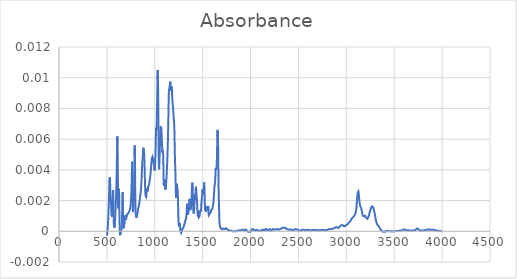
| Category | Absorbance |
|---|---|
| 3997.70514 | 0 |
| 3995.77668 | 0 |
| 3993.84822 | 0 |
| 3991.91975 | 0 |
| 3989.99129 | 0 |
| 3988.06283 | 0 |
| 3986.13436 | 0 |
| 3984.2059 | 0 |
| 3982.27743 | 0 |
| 3980.34897 | 0 |
| 3978.42051 | 0 |
| 3976.49204 | 0 |
| 3974.56358 | 0 |
| 3972.63512 | 0 |
| 3970.70665 | 0 |
| 3968.77819 | 0 |
| 3966.84973 | 0 |
| 3964.92126 | 0 |
| 3962.9928 | 0 |
| 3961.06433 | 0 |
| 3959.13587 | 0 |
| 3957.20741 | 0 |
| 3955.27894 | 0 |
| 3953.35048 | 0 |
| 3951.42202 | 0 |
| 3949.49355 | 0 |
| 3947.56509 | 0 |
| 3945.63663 | 0 |
| 3943.70816 | 0 |
| 3941.7797 | 0 |
| 3939.85123 | 0 |
| 3937.92277 | 0 |
| 3935.99431 | 0 |
| 3934.06584 | 0 |
| 3932.13738 | 0 |
| 3930.20892 | 0 |
| 3928.28045 | 0 |
| 3926.35199 | 0 |
| 3924.42353 | 0 |
| 3922.49506 | 0 |
| 3920.5666 | 0 |
| 3918.63813 | 0 |
| 3916.70967 | 0 |
| 3914.78121 | 0 |
| 3912.85274 | 0 |
| 3910.92428 | 0 |
| 3908.99582 | 0 |
| 3907.06735 | 0 |
| 3905.13889 | 0 |
| 3903.21043 | 0 |
| 3901.28196 | 0 |
| 3899.3535 | 0 |
| 3897.42503 | 0 |
| 3895.49657 | 0 |
| 3893.56811 | 0 |
| 3891.63964 | 0 |
| 3889.71118 | 0 |
| 3887.78272 | 0 |
| 3885.85425 | 0 |
| 3883.92579 | 0 |
| 3881.99733 | 0 |
| 3880.06886 | 0 |
| 3878.1404 | 0 |
| 3876.21193 | 0 |
| 3874.28347 | 0 |
| 3872.35501 | 0 |
| 3870.42654 | 0 |
| 3868.49808 | 0 |
| 3866.56962 | 0 |
| 3864.64115 | 0 |
| 3862.71269 | 0 |
| 3860.78422 | 0 |
| 3858.85576 | 0 |
| 3856.9273 | 0 |
| 3854.99883 | 0 |
| 3853.07037 | 0 |
| 3851.14191 | 0 |
| 3849.21344 | 0 |
| 3847.28498 | 0 |
| 3845.35652 | 0 |
| 3843.42805 | 0 |
| 3841.49959 | 0 |
| 3839.57112 | 0 |
| 3837.64266 | 0 |
| 3835.7142 | 0 |
| 3833.78573 | 0 |
| 3831.85727 | 0 |
| 3829.92881 | 0 |
| 3828.00034 | 0 |
| 3826.07188 | 0 |
| 3824.14342 | 0 |
| 3822.21495 | 0 |
| 3820.28649 | 0 |
| 3818.35802 | 0 |
| 3816.42956 | 0 |
| 3814.5011 | 0 |
| 3812.57263 | 0 |
| 3810.64417 | 0 |
| 3808.71571 | 0 |
| 3806.78724 | 0 |
| 3804.85878 | 0 |
| 3802.93032 | 0 |
| 3801.00185 | 0 |
| 3799.07339 | 0 |
| 3797.14492 | 0 |
| 3795.21646 | 0 |
| 3793.288 | 0 |
| 3791.35953 | 0 |
| 3789.43107 | 0 |
| 3787.50261 | 0 |
| 3785.57414 | 0 |
| 3783.64568 | 0 |
| 3781.71722 | 0 |
| 3779.78875 | 0 |
| 3777.86029 | 0 |
| 3775.93182 | 0 |
| 3774.00336 | 0 |
| 3772.0749 | 0 |
| 3770.14643 | 0 |
| 3768.21797 | 0 |
| 3766.28951 | 0 |
| 3764.36104 | 0 |
| 3762.43258 | 0 |
| 3760.50412 | 0 |
| 3758.57565 | 0 |
| 3756.64719 | 0 |
| 3754.71872 | 0 |
| 3752.79026 | 0 |
| 3750.8618 | 0 |
| 3748.93333 | 0 |
| 3747.00487 | 0 |
| 3745.07641 | 0 |
| 3743.14794 | 0 |
| 3741.21948 | 0 |
| 3739.29102 | 0 |
| 3737.36255 | 0 |
| 3735.43409 | 0 |
| 3733.50562 | 0 |
| 3731.57716 | 0 |
| 3729.6487 | 0 |
| 3727.72023 | 0 |
| 3725.79177 | 0 |
| 3723.86331 | 0 |
| 3721.93484 | 0 |
| 3720.00638 | 0 |
| 3718.07791 | 0 |
| 3716.14945 | 0 |
| 3714.22099 | 0 |
| 3712.29252 | 0 |
| 3710.36406 | 0 |
| 3708.4356 | 0 |
| 3706.50713 | 0 |
| 3704.57867 | 0 |
| 3702.65021 | 0 |
| 3700.72174 | 0 |
| 3698.79328 | 0 |
| 3696.86481 | 0 |
| 3694.93635 | 0 |
| 3693.00789 | 0 |
| 3691.07942 | 0 |
| 3689.15096 | 0 |
| 3687.2225 | 0 |
| 3685.29403 | 0 |
| 3683.36557 | 0 |
| 3681.43711 | 0 |
| 3679.50864 | 0 |
| 3677.58018 | 0 |
| 3675.65171 | 0 |
| 3673.72325 | 0 |
| 3671.79479 | 0 |
| 3669.86632 | 0 |
| 3667.93786 | 0 |
| 3666.0094 | 0 |
| 3664.08093 | 0 |
| 3662.15247 | 0 |
| 3660.22401 | 0 |
| 3658.29554 | 0 |
| 3656.36708 | 0 |
| 3654.43861 | 0 |
| 3652.51015 | 0 |
| 3650.58169 | 0 |
| 3648.65322 | 0 |
| 3646.72476 | 0 |
| 3644.7963 | 0 |
| 3642.86783 | 0 |
| 3640.93937 | 0 |
| 3639.01091 | 0 |
| 3637.08244 | 0 |
| 3635.15398 | 0 |
| 3633.22551 | 0 |
| 3631.29705 | 0 |
| 3629.36859 | 0 |
| 3627.44012 | 0 |
| 3625.51166 | 0 |
| 3623.5832 | 0 |
| 3621.65473 | 0 |
| 3619.72627 | 0 |
| 3617.79781 | 0 |
| 3615.86934 | 0 |
| 3613.94088 | 0 |
| 3612.01241 | 0 |
| 3610.08395 | 0 |
| 3608.15549 | 0 |
| 3606.22702 | 0 |
| 3604.29856 | 0 |
| 3602.3701 | 0 |
| 3600.44163 | 0 |
| 3598.51317 | 0 |
| 3596.58471 | 0 |
| 3594.65624 | 0 |
| 3592.72778 | 0 |
| 3590.79931 | 0 |
| 3588.87085 | 0 |
| 3586.94239 | 0 |
| 3585.01392 | 0 |
| 3583.08546 | 0 |
| 3581.157 | 0 |
| 3579.22853 | 0 |
| 3577.30007 | 0 |
| 3575.3716 | 0 |
| 3573.44314 | 0 |
| 3571.51468 | 0 |
| 3569.58621 | 0 |
| 3567.65775 | 0 |
| 3565.72929 | 0 |
| 3563.80082 | 0 |
| 3561.87236 | 0 |
| 3559.9439 | 0 |
| 3558.01543 | 0 |
| 3556.08697 | 0 |
| 3554.1585 | 0 |
| 3552.23004 | 0 |
| 3550.30158 | 0 |
| 3548.37311 | 0 |
| 3546.44465 | 0 |
| 3544.51619 | 0 |
| 3542.58772 | 0 |
| 3540.65926 | 0 |
| 3538.7308 | 0 |
| 3536.80233 | 0 |
| 3534.87387 | 0 |
| 3532.9454 | 0 |
| 3531.01694 | 0 |
| 3529.08848 | 0 |
| 3527.16001 | 0 |
| 3525.23155 | 0 |
| 3523.30309 | 0 |
| 3521.37462 | 0 |
| 3519.44616 | 0 |
| 3517.5177 | 0 |
| 3515.58923 | 0 |
| 3513.66077 | 0 |
| 3511.7323 | 0 |
| 3509.80384 | 0 |
| 3507.87538 | 0 |
| 3505.94691 | 0 |
| 3504.01845 | 0 |
| 3502.08999 | 0 |
| 3500.16152 | 0 |
| 3498.23306 | 0 |
| 3496.3046 | 0 |
| 3494.37613 | 0 |
| 3492.44767 | 0 |
| 3490.5192 | 0 |
| 3488.59074 | 0 |
| 3486.66228 | 0 |
| 3484.73381 | 0 |
| 3482.80535 | 0 |
| 3480.87689 | 0 |
| 3478.94842 | 0 |
| 3477.01996 | 0 |
| 3475.0915 | 0 |
| 3473.16303 | 0 |
| 3471.23457 | 0 |
| 3469.3061 | 0 |
| 3467.37764 | 0 |
| 3465.44918 | 0 |
| 3463.52071 | 0 |
| 3461.59225 | 0 |
| 3459.66379 | 0 |
| 3457.73532 | 0 |
| 3455.80686 | 0 |
| 3453.8784 | 0 |
| 3451.94993 | 0 |
| 3450.02147 | 0 |
| 3448.093 | 0 |
| 3446.16454 | 0 |
| 3444.23608 | 0 |
| 3442.30761 | 0 |
| 3440.37915 | 0 |
| 3438.45069 | 0 |
| 3436.52222 | 0 |
| 3434.59376 | 0 |
| 3432.66529 | 0 |
| 3430.73683 | 0 |
| 3428.80837 | 0 |
| 3426.8799 | 0 |
| 3424.95144 | 0 |
| 3423.02298 | 0 |
| 3421.09451 | 0 |
| 3419.16605 | 0 |
| 3417.23759 | 0 |
| 3415.30912 | 0 |
| 3413.38066 | 0 |
| 3411.45219 | 0 |
| 3409.52373 | 0 |
| 3407.59527 | 0 |
| 3405.6668 | 0 |
| 3403.73834 | 0 |
| 3401.80988 | 0 |
| 3399.88141 | 0 |
| 3397.95295 | 0 |
| 3396.02449 | 0 |
| 3394.09602 | 0 |
| 3392.16756 | 0 |
| 3390.23909 | 0 |
| 3388.31063 | 0 |
| 3386.38217 | 0 |
| 3384.4537 | 0 |
| 3382.52524 | 0 |
| 3380.59678 | 0 |
| 3378.66831 | 0 |
| 3376.73985 | 0 |
| 3374.81139 | 0 |
| 3372.88292 | 0 |
| 3370.95446 | 0 |
| 3369.02599 | 0 |
| 3367.09753 | 0 |
| 3365.16907 | 0 |
| 3363.2406 | 0 |
| 3361.31214 | 0 |
| 3359.38368 | 0 |
| 3357.45521 | 0 |
| 3355.52675 | 0 |
| 3353.59829 | 0 |
| 3351.66982 | 0 |
| 3349.74136 | 0 |
| 3347.81289 | 0 |
| 3345.88443 | 0 |
| 3343.95597 | 0 |
| 3342.0275 | 0 |
| 3340.09904 | 0 |
| 3338.17058 | 0 |
| 3336.24211 | 0 |
| 3334.31365 | 0 |
| 3332.38519 | 0 |
| 3330.45672 | 0 |
| 3328.52826 | 0 |
| 3326.59979 | 0 |
| 3324.67133 | 0 |
| 3322.74287 | 0 |
| 3320.8144 | 0 |
| 3318.88594 | 0 |
| 3316.95748 | 0.001 |
| 3315.02901 | 0.001 |
| 3313.10055 | 0.001 |
| 3311.17208 | 0.001 |
| 3309.24362 | 0.001 |
| 3307.31516 | 0.001 |
| 3305.38669 | 0.001 |
| 3303.45823 | 0.001 |
| 3301.52977 | 0.001 |
| 3299.6013 | 0.001 |
| 3297.67284 | 0.001 |
| 3295.74438 | 0.001 |
| 3293.81591 | 0.001 |
| 3291.88745 | 0.001 |
| 3289.95898 | 0.001 |
| 3288.03052 | 0.001 |
| 3286.10206 | 0.001 |
| 3284.17359 | 0.001 |
| 3282.24513 | 0.002 |
| 3280.31667 | 0.002 |
| 3278.3882 | 0.002 |
| 3276.45974 | 0.002 |
| 3274.53128 | 0.002 |
| 3272.60281 | 0.002 |
| 3270.67435 | 0.002 |
| 3268.74588 | 0.002 |
| 3266.81742 | 0.002 |
| 3264.88896 | 0.002 |
| 3262.96049 | 0.002 |
| 3261.03203 | 0.002 |
| 3259.10357 | 0.002 |
| 3257.1751 | 0.002 |
| 3255.24664 | 0.001 |
| 3253.31818 | 0.001 |
| 3251.38971 | 0.001 |
| 3249.46125 | 0.001 |
| 3247.53278 | 0.001 |
| 3245.60432 | 0.001 |
| 3243.67586 | 0.001 |
| 3241.74739 | 0.001 |
| 3239.81893 | 0.001 |
| 3237.89047 | 0.001 |
| 3235.962 | 0.001 |
| 3234.03354 | 0.001 |
| 3232.10508 | 0.001 |
| 3230.17661 | 0.001 |
| 3228.24815 | 0.001 |
| 3226.31968 | 0.001 |
| 3224.39122 | 0.001 |
| 3222.46276 | 0.001 |
| 3220.53429 | 0.001 |
| 3218.60583 | 0.001 |
| 3216.67737 | 0.001 |
| 3214.7489 | 0.001 |
| 3212.82044 | 0.001 |
| 3210.89198 | 0.001 |
| 3208.96351 | 0.001 |
| 3207.03505 | 0.001 |
| 3205.10658 | 0.001 |
| 3203.17812 | 0.001 |
| 3201.24966 | 0.001 |
| 3199.32119 | 0.001 |
| 3197.39273 | 0.001 |
| 3195.46427 | 0.001 |
| 3193.5358 | 0.001 |
| 3191.60734 | 0.001 |
| 3189.67888 | 0.001 |
| 3187.75041 | 0.001 |
| 3185.82195 | 0.001 |
| 3183.89348 | 0.001 |
| 3181.96502 | 0.001 |
| 3180.03656 | 0.001 |
| 3178.10809 | 0.001 |
| 3176.17963 | 0.001 |
| 3174.25117 | 0.001 |
| 3172.3227 | 0.001 |
| 3170.39424 | 0.001 |
| 3168.46577 | 0.001 |
| 3166.53731 | 0.001 |
| 3164.60885 | 0.001 |
| 3162.68038 | 0.001 |
| 3160.75192 | 0.001 |
| 3158.82346 | 0.001 |
| 3156.89499 | 0.001 |
| 3154.96653 | 0.002 |
| 3153.03807 | 0.002 |
| 3151.1096 | 0.002 |
| 3149.18114 | 0.002 |
| 3147.25267 | 0.002 |
| 3145.32421 | 0.002 |
| 3143.39575 | 0.002 |
| 3141.46728 | 0.002 |
| 3139.53882 | 0.002 |
| 3137.61036 | 0.002 |
| 3135.68189 | 0.002 |
| 3133.75343 | 0.002 |
| 3131.82497 | 0.002 |
| 3129.8965 | 0.002 |
| 3127.96804 | 0.003 |
| 3126.03957 | 0.003 |
| 3124.11111 | 0.003 |
| 3122.18265 | 0.003 |
| 3120.25418 | 0.003 |
| 3118.32572 | 0.003 |
| 3116.39726 | 0.002 |
| 3114.46879 | 0.002 |
| 3112.54033 | 0.002 |
| 3110.61187 | 0.002 |
| 3108.6834 | 0.002 |
| 3106.75494 | 0.002 |
| 3104.82647 | 0.001 |
| 3102.89801 | 0.001 |
| 3100.96955 | 0.001 |
| 3099.04108 | 0.001 |
| 3097.11262 | 0.001 |
| 3095.18416 | 0.001 |
| 3093.25569 | 0.001 |
| 3091.32723 | 0.001 |
| 3089.39877 | 0.001 |
| 3087.4703 | 0.001 |
| 3085.54184 | 0.001 |
| 3083.61337 | 0.001 |
| 3081.68491 | 0.001 |
| 3079.75645 | 0.001 |
| 3077.82798 | 0.001 |
| 3075.89952 | 0.001 |
| 3073.97106 | 0.001 |
| 3072.04259 | 0.001 |
| 3070.11413 | 0.001 |
| 3068.18567 | 0.001 |
| 3066.2572 | 0.001 |
| 3064.32874 | 0.001 |
| 3062.40027 | 0.001 |
| 3060.47181 | 0.001 |
| 3058.54335 | 0.001 |
| 3056.61488 | 0.001 |
| 3054.68642 | 0.001 |
| 3052.75796 | 0.001 |
| 3050.82949 | 0.001 |
| 3048.90103 | 0.001 |
| 3046.97257 | 0.001 |
| 3045.0441 | 0.001 |
| 3043.11564 | 0.001 |
| 3041.18717 | 0.001 |
| 3039.25871 | 0.001 |
| 3037.33025 | 0.001 |
| 3035.40178 | 0.001 |
| 3033.47332 | 0.001 |
| 3031.54486 | 0.001 |
| 3029.61639 | 0.001 |
| 3027.68793 | 0.001 |
| 3025.75946 | 0.001 |
| 3023.831 | 0.001 |
| 3021.90254 | 0.001 |
| 3019.97407 | 0.001 |
| 3018.04561 | 0.001 |
| 3016.11715 | 0 |
| 3014.18868 | 0 |
| 3012.26022 | 0 |
| 3010.33176 | 0 |
| 3008.40329 | 0 |
| 3006.47483 | 0 |
| 3004.54636 | 0 |
| 3002.6179 | 0 |
| 3000.68944 | 0 |
| 2998.76097 | 0 |
| 2996.83251 | 0 |
| 2994.90405 | 0 |
| 2992.97558 | 0 |
| 2991.04712 | 0 |
| 2989.11866 | 0 |
| 2987.19019 | 0 |
| 2985.26173 | 0 |
| 2983.33326 | 0 |
| 2981.4048 | 0 |
| 2979.47634 | 0 |
| 2977.54787 | 0 |
| 2975.61941 | 0 |
| 2973.69095 | 0 |
| 2971.76248 | 0 |
| 2969.83402 | 0 |
| 2967.90556 | 0 |
| 2965.97709 | 0 |
| 2964.04863 | 0 |
| 2962.12016 | 0 |
| 2960.1917 | 0 |
| 2958.26324 | 0 |
| 2956.33477 | 0 |
| 2954.40631 | 0 |
| 2952.47785 | 0 |
| 2950.54938 | 0 |
| 2948.62092 | 0 |
| 2946.69246 | 0 |
| 2944.76399 | 0 |
| 2942.83553 | 0 |
| 2940.90706 | 0 |
| 2938.9786 | 0 |
| 2937.05014 | 0 |
| 2935.12167 | 0 |
| 2933.19321 | 0 |
| 2931.26475 | 0 |
| 2929.33628 | 0 |
| 2927.40782 | 0 |
| 2925.47936 | 0 |
| 2923.55089 | 0 |
| 2921.62243 | 0 |
| 2919.69396 | 0 |
| 2917.7655 | 0 |
| 2915.83704 | 0 |
| 2913.90857 | 0 |
| 2911.98011 | 0 |
| 2910.05165 | 0 |
| 2908.12318 | 0 |
| 2906.19472 | 0 |
| 2904.26626 | 0 |
| 2902.33779 | 0 |
| 2900.40933 | 0 |
| 2898.48086 | 0 |
| 2896.5524 | 0 |
| 2894.62394 | 0 |
| 2892.69547 | 0 |
| 2890.76701 | 0 |
| 2888.83855 | 0 |
| 2886.91008 | 0 |
| 2884.98162 | 0 |
| 2883.05315 | 0 |
| 2881.12469 | 0 |
| 2879.19623 | 0 |
| 2877.26776 | 0 |
| 2875.3393 | 0 |
| 2873.41084 | 0 |
| 2871.48237 | 0 |
| 2869.55391 | 0 |
| 2867.62545 | 0 |
| 2865.69698 | 0 |
| 2863.76852 | 0 |
| 2861.84005 | 0 |
| 2859.91159 | 0 |
| 2857.98313 | 0 |
| 2856.05466 | 0 |
| 2854.1262 | 0 |
| 2852.19774 | 0 |
| 2850.26927 | 0 |
| 2848.34081 | 0 |
| 2846.41235 | 0 |
| 2844.48388 | 0 |
| 2842.55542 | 0 |
| 2840.62695 | 0 |
| 2838.69849 | 0 |
| 2836.77003 | 0 |
| 2834.84156 | 0 |
| 2832.9131 | 0 |
| 2830.98464 | 0 |
| 2829.05617 | 0 |
| 2827.12771 | 0 |
| 2825.19925 | 0 |
| 2823.27078 | 0 |
| 2821.34232 | 0 |
| 2819.41385 | 0 |
| 2817.48539 | 0 |
| 2815.55693 | 0 |
| 2813.62846 | 0 |
| 2811.7 | 0 |
| 2809.77154 | 0 |
| 2807.84307 | 0 |
| 2805.91461 | 0 |
| 2803.98615 | 0 |
| 2802.05768 | 0 |
| 2800.12922 | 0 |
| 2798.20075 | 0 |
| 2796.27229 | 0 |
| 2794.34383 | 0 |
| 2792.41536 | 0 |
| 2790.4869 | 0 |
| 2788.55844 | 0 |
| 2786.62997 | 0 |
| 2784.70151 | 0 |
| 2782.77305 | 0 |
| 2780.84458 | 0 |
| 2778.91612 | 0 |
| 2776.98765 | 0 |
| 2775.05919 | 0 |
| 2773.13073 | 0 |
| 2771.20226 | 0 |
| 2769.2738 | 0 |
| 2767.34534 | 0 |
| 2765.41687 | 0 |
| 2763.48841 | 0 |
| 2761.55995 | 0 |
| 2759.63148 | 0 |
| 2757.70302 | 0 |
| 2755.77455 | 0 |
| 2753.84609 | 0 |
| 2751.91763 | 0 |
| 2749.98916 | 0 |
| 2748.0607 | 0 |
| 2746.13224 | 0 |
| 2744.20377 | 0 |
| 2742.27531 | 0 |
| 2740.34684 | 0 |
| 2738.41838 | 0 |
| 2736.48992 | 0 |
| 2734.56145 | 0 |
| 2732.63299 | 0 |
| 2730.70453 | 0 |
| 2728.77606 | 0 |
| 2726.8476 | 0 |
| 2724.91914 | 0 |
| 2722.99067 | 0 |
| 2721.06221 | 0 |
| 2719.13374 | 0 |
| 2717.20528 | 0 |
| 2715.27682 | 0 |
| 2713.34835 | 0 |
| 2711.41989 | 0 |
| 2709.49143 | 0 |
| 2707.56296 | 0 |
| 2705.6345 | 0 |
| 2703.70604 | 0 |
| 2701.77757 | 0 |
| 2699.84911 | 0 |
| 2697.92064 | 0 |
| 2695.99218 | 0 |
| 2694.06372 | 0 |
| 2692.13525 | 0 |
| 2690.20679 | 0 |
| 2688.27833 | 0 |
| 2686.34986 | 0 |
| 2684.4214 | 0 |
| 2682.49294 | 0 |
| 2680.56447 | 0 |
| 2678.63601 | 0 |
| 2676.70754 | 0 |
| 2674.77908 | 0 |
| 2672.85062 | 0 |
| 2670.92215 | 0 |
| 2668.99369 | 0 |
| 2667.06523 | 0 |
| 2665.13676 | 0 |
| 2663.2083 | 0 |
| 2661.27984 | 0 |
| 2659.35137 | 0 |
| 2657.42291 | 0 |
| 2655.49444 | 0 |
| 2653.56598 | 0 |
| 2651.63752 | 0 |
| 2649.70905 | 0 |
| 2647.78059 | 0 |
| 2645.85213 | 0 |
| 2643.92366 | 0 |
| 2641.9952 | 0 |
| 2640.06674 | 0 |
| 2638.13827 | 0 |
| 2636.20981 | 0 |
| 2634.28134 | 0 |
| 2632.35288 | 0 |
| 2630.42442 | 0 |
| 2628.49595 | 0 |
| 2626.56749 | 0 |
| 2624.63903 | 0 |
| 2622.71056 | 0 |
| 2620.7821 | 0 |
| 2618.85364 | 0 |
| 2616.92517 | 0 |
| 2614.99671 | 0 |
| 2613.06824 | 0 |
| 2611.13978 | 0 |
| 2609.21132 | 0 |
| 2607.28285 | 0 |
| 2605.35439 | 0 |
| 2603.42593 | 0 |
| 2601.49746 | 0 |
| 2599.569 | 0 |
| 2597.64053 | 0 |
| 2595.71207 | 0 |
| 2593.78361 | 0 |
| 2591.85514 | 0 |
| 2589.92668 | 0 |
| 2587.99822 | 0 |
| 2586.06975 | 0 |
| 2584.14129 | 0 |
| 2582.21283 | 0 |
| 2580.28436 | 0 |
| 2578.3559 | 0 |
| 2576.42743 | 0 |
| 2574.49897 | 0 |
| 2572.57051 | 0 |
| 2570.64204 | 0 |
| 2568.71358 | 0 |
| 2566.78512 | 0 |
| 2564.85665 | 0 |
| 2562.92819 | 0 |
| 2560.99973 | 0 |
| 2559.07126 | 0 |
| 2557.1428 | 0 |
| 2555.21433 | 0 |
| 2553.28587 | 0 |
| 2551.35741 | 0 |
| 2549.42894 | 0 |
| 2547.50048 | 0 |
| 2545.57202 | 0 |
| 2543.64355 | 0 |
| 2541.71509 | 0 |
| 2539.78663 | 0 |
| 2537.85816 | 0 |
| 2535.9297 | 0 |
| 2534.00123 | 0 |
| 2532.07277 | 0 |
| 2530.14431 | 0 |
| 2528.21584 | 0 |
| 2526.28738 | 0 |
| 2524.35892 | 0 |
| 2522.43045 | 0 |
| 2520.50199 | 0 |
| 2518.57353 | 0 |
| 2516.64506 | 0 |
| 2514.7166 | 0 |
| 2512.78813 | 0 |
| 2510.85967 | 0 |
| 2508.93121 | 0 |
| 2507.00274 | 0 |
| 2505.07428 | 0 |
| 2503.14582 | 0 |
| 2501.21735 | 0 |
| 2499.28889 | 0 |
| 2497.36043 | 0 |
| 2495.43196 | 0 |
| 2493.5035 | 0 |
| 2491.57503 | 0 |
| 2489.64657 | 0 |
| 2487.71811 | 0 |
| 2485.78964 | 0 |
| 2483.86118 | 0 |
| 2481.93272 | 0 |
| 2480.00425 | 0 |
| 2478.07579 | 0 |
| 2476.14733 | 0 |
| 2474.21886 | 0 |
| 2472.2904 | 0 |
| 2470.36193 | 0 |
| 2468.43347 | 0 |
| 2466.50501 | 0 |
| 2464.57654 | 0 |
| 2462.64808 | 0 |
| 2460.71962 | 0 |
| 2458.79115 | 0 |
| 2456.86269 | 0 |
| 2454.93422 | 0 |
| 2453.00576 | 0 |
| 2451.0773 | 0 |
| 2449.14883 | 0 |
| 2447.22037 | 0 |
| 2445.29191 | 0 |
| 2443.36344 | 0 |
| 2441.43498 | 0 |
| 2439.50652 | 0 |
| 2437.57805 | 0 |
| 2435.64959 | 0 |
| 2433.72112 | 0 |
| 2431.79266 | 0 |
| 2429.8642 | 0 |
| 2427.93573 | 0 |
| 2426.00727 | 0 |
| 2424.07881 | 0 |
| 2422.15034 | 0 |
| 2420.22188 | 0 |
| 2418.29342 | 0 |
| 2416.36495 | 0 |
| 2414.43649 | 0 |
| 2412.50802 | 0 |
| 2410.57956 | 0 |
| 2408.6511 | 0 |
| 2406.72263 | 0 |
| 2404.79417 | 0 |
| 2402.86571 | 0 |
| 2400.93724 | 0 |
| 2399.00878 | 0 |
| 2397.08032 | 0 |
| 2395.15185 | 0 |
| 2393.22339 | 0 |
| 2391.29492 | 0 |
| 2389.36646 | 0 |
| 2387.438 | 0 |
| 2385.50953 | 0 |
| 2383.58107 | 0 |
| 2381.65261 | 0 |
| 2379.72414 | 0 |
| 2377.79568 | 0 |
| 2375.86722 | 0 |
| 2373.93875 | 0 |
| 2372.01029 | 0 |
| 2370.08182 | 0 |
| 2368.15336 | 0 |
| 2366.2249 | 0 |
| 2364.29643 | 0 |
| 2362.36797 | 0 |
| 2360.43951 | 0 |
| 2358.51104 | 0 |
| 2356.58258 | 0 |
| 2354.65412 | 0 |
| 2352.72565 | 0 |
| 2350.79719 | 0 |
| 2348.86872 | 0 |
| 2346.94026 | 0 |
| 2345.0118 | 0 |
| 2343.08333 | 0 |
| 2341.15487 | 0 |
| 2339.22641 | 0 |
| 2337.29794 | 0 |
| 2335.36948 | 0 |
| 2333.44102 | 0 |
| 2331.51255 | 0 |
| 2329.58409 | 0 |
| 2327.65562 | 0 |
| 2325.72716 | 0 |
| 2323.7987 | 0 |
| 2321.87023 | 0 |
| 2319.94177 | 0 |
| 2318.01331 | 0 |
| 2316.08484 | 0 |
| 2314.15638 | 0 |
| 2312.22791 | 0 |
| 2310.29945 | 0 |
| 2308.37099 | 0 |
| 2306.44252 | 0 |
| 2304.51406 | 0 |
| 2302.5856 | 0 |
| 2300.65713 | 0 |
| 2298.72867 | 0 |
| 2296.80021 | 0 |
| 2294.87174 | 0 |
| 2292.94328 | 0 |
| 2291.01481 | 0 |
| 2289.08635 | 0 |
| 2287.15789 | 0 |
| 2285.22942 | 0 |
| 2283.30096 | 0 |
| 2281.3725 | 0 |
| 2279.44403 | 0 |
| 2277.51557 | 0 |
| 2275.58711 | 0 |
| 2273.65864 | 0 |
| 2271.73018 | 0 |
| 2269.80171 | 0 |
| 2267.87325 | 0 |
| 2265.94479 | 0 |
| 2264.01632 | 0 |
| 2262.08786 | 0 |
| 2260.1594 | 0 |
| 2258.23093 | 0 |
| 2256.30247 | 0 |
| 2254.37401 | 0 |
| 2252.44554 | 0 |
| 2250.51708 | 0 |
| 2248.58861 | 0 |
| 2246.66015 | 0 |
| 2244.73169 | 0 |
| 2242.80322 | 0 |
| 2240.87476 | 0 |
| 2238.9463 | 0 |
| 2237.01783 | 0 |
| 2235.08937 | 0 |
| 2233.16091 | 0 |
| 2231.23244 | 0 |
| 2229.30398 | 0 |
| 2227.37551 | 0 |
| 2225.44705 | 0 |
| 2223.51859 | 0 |
| 2221.59012 | 0 |
| 2219.66166 | 0 |
| 2217.7332 | 0 |
| 2215.80473 | 0 |
| 2213.87627 | 0 |
| 2211.94781 | 0 |
| 2210.01934 | 0 |
| 2208.09088 | 0 |
| 2206.16241 | 0 |
| 2204.23395 | 0 |
| 2202.30549 | 0 |
| 2200.37702 | 0 |
| 2198.44856 | 0 |
| 2196.5201 | 0 |
| 2194.59163 | 0 |
| 2192.66317 | 0 |
| 2190.73471 | 0 |
| 2188.80624 | 0 |
| 2186.87778 | 0 |
| 2184.94931 | 0 |
| 2183.02085 | 0 |
| 2181.09239 | 0 |
| 2179.16392 | 0 |
| 2177.23546 | 0 |
| 2175.307 | 0 |
| 2173.37853 | 0 |
| 2171.45007 | 0 |
| 2169.5216 | 0 |
| 2167.59314 | 0 |
| 2165.66468 | 0 |
| 2163.73621 | 0 |
| 2161.80775 | 0 |
| 2159.87929 | 0 |
| 2157.95082 | 0 |
| 2156.02236 | 0 |
| 2154.0939 | 0 |
| 2152.16543 | 0 |
| 2150.23697 | 0 |
| 2148.3085 | 0 |
| 2146.38004 | 0 |
| 2144.45158 | 0 |
| 2142.52311 | 0 |
| 2140.59465 | 0 |
| 2138.66619 | 0 |
| 2136.73772 | 0 |
| 2134.80926 | 0 |
| 2132.8808 | 0 |
| 2130.95233 | 0 |
| 2129.02387 | 0 |
| 2127.0954 | 0 |
| 2125.16694 | 0 |
| 2123.23848 | 0 |
| 2121.31001 | 0 |
| 2119.38155 | 0 |
| 2117.45309 | 0 |
| 2115.52462 | 0 |
| 2113.59616 | 0 |
| 2111.6677 | 0 |
| 2109.73923 | 0 |
| 2107.81077 | 0 |
| 2105.8823 | 0 |
| 2103.95384 | 0 |
| 2102.02538 | 0 |
| 2100.09691 | 0 |
| 2098.16845 | 0 |
| 2096.23999 | 0 |
| 2094.31152 | 0 |
| 2092.38306 | 0 |
| 2090.4546 | 0 |
| 2088.52613 | 0 |
| 2086.59767 | 0 |
| 2084.6692 | 0 |
| 2082.74074 | 0 |
| 2080.81228 | 0 |
| 2078.88381 | 0 |
| 2076.95535 | 0 |
| 2075.02689 | 0 |
| 2073.09842 | 0 |
| 2071.16996 | 0 |
| 2069.2415 | 0 |
| 2067.31303 | 0 |
| 2065.38457 | 0 |
| 2063.4561 | 0 |
| 2061.52764 | 0 |
| 2059.59918 | 0 |
| 2057.67071 | 0 |
| 2055.74225 | 0 |
| 2053.81379 | 0 |
| 2051.88532 | 0 |
| 2049.95686 | 0 |
| 2048.0284 | 0 |
| 2046.09993 | 0 |
| 2044.17147 | 0 |
| 2042.243 | 0 |
| 2040.31454 | 0 |
| 2038.38608 | 0 |
| 2036.45761 | 0 |
| 2034.52915 | 0 |
| 2032.60069 | 0 |
| 2030.67222 | 0 |
| 2028.74376 | 0 |
| 2026.81529 | 0 |
| 2024.88683 | 0 |
| 2022.95837 | 0 |
| 2021.0299 | 0 |
| 2019.10144 | 0 |
| 2017.17298 | 0 |
| 2015.24451 | 0 |
| 2013.31605 | 0 |
| 2011.38759 | 0 |
| 2009.45912 | 0 |
| 2007.53066 | 0 |
| 2005.60219 | 0 |
| 2003.67373 | 0 |
| 2001.74527 | 0 |
| 1999.8168 | 0 |
| 1997.88834 | 0 |
| 1995.95988 | 0 |
| 1994.03141 | 0 |
| 1992.10295 | 0 |
| 1990.17449 | 0 |
| 1988.24602 | 0 |
| 1986.31756 | 0 |
| 1984.38909 | 0 |
| 1982.46063 | 0 |
| 1980.53217 | 0 |
| 1978.6037 | 0 |
| 1976.67524 | 0 |
| 1974.74678 | 0 |
| 1972.81831 | 0 |
| 1970.88985 | 0 |
| 1968.96139 | 0 |
| 1967.03292 | 0 |
| 1965.10446 | 0 |
| 1963.17599 | 0 |
| 1961.24753 | 0 |
| 1959.31907 | 0 |
| 1957.3906 | 0 |
| 1955.46214 | 0 |
| 1953.53368 | 0 |
| 1951.60521 | 0 |
| 1949.67675 | 0 |
| 1947.74829 | 0 |
| 1945.81982 | 0 |
| 1943.89136 | 0 |
| 1941.96289 | 0 |
| 1940.03443 | 0 |
| 1938.10597 | 0 |
| 1936.1775 | 0 |
| 1934.24904 | 0 |
| 1932.32058 | 0 |
| 1930.39211 | 0 |
| 1928.46365 | 0 |
| 1926.53519 | 0 |
| 1924.60672 | 0 |
| 1922.67826 | 0 |
| 1920.74979 | 0 |
| 1918.82133 | 0 |
| 1916.89287 | 0 |
| 1914.9644 | 0 |
| 1913.03594 | 0 |
| 1911.10748 | 0 |
| 1909.17901 | 0 |
| 1907.25055 | 0 |
| 1905.32209 | 0 |
| 1903.39362 | 0 |
| 1901.46516 | 0 |
| 1899.53669 | 0 |
| 1897.60823 | 0 |
| 1895.67977 | 0 |
| 1893.7513 | 0 |
| 1891.82284 | 0 |
| 1889.89438 | 0 |
| 1887.96591 | 0 |
| 1886.03745 | 0 |
| 1884.10898 | 0 |
| 1882.18052 | 0 |
| 1880.25206 | 0 |
| 1878.32359 | 0 |
| 1876.39513 | 0 |
| 1874.46667 | 0 |
| 1872.5382 | 0 |
| 1870.60974 | 0 |
| 1868.68128 | 0 |
| 1866.75281 | 0 |
| 1864.82435 | 0 |
| 1862.89588 | 0 |
| 1860.96742 | 0 |
| 1859.03896 | 0 |
| 1857.11049 | 0 |
| 1855.18203 | 0 |
| 1853.25357 | 0 |
| 1851.3251 | 0 |
| 1849.39664 | 0 |
| 1847.46818 | 0 |
| 1845.53971 | 0 |
| 1843.61125 | 0 |
| 1841.68278 | 0 |
| 1839.75432 | 0 |
| 1837.82586 | 0 |
| 1835.89739 | 0 |
| 1833.96893 | 0 |
| 1832.04047 | 0 |
| 1830.112 | 0 |
| 1828.18354 | 0 |
| 1826.25508 | 0 |
| 1824.32661 | 0 |
| 1822.39815 | 0 |
| 1820.46968 | 0 |
| 1818.54122 | 0 |
| 1816.61276 | 0 |
| 1814.68429 | 0 |
| 1812.75583 | 0 |
| 1810.82737 | 0 |
| 1808.8989 | 0 |
| 1806.97044 | 0 |
| 1805.04198 | 0 |
| 1803.11351 | 0 |
| 1801.18505 | 0 |
| 1799.25658 | 0 |
| 1797.32812 | 0 |
| 1795.39966 | 0 |
| 1793.47119 | 0 |
| 1791.54273 | 0 |
| 1789.61427 | 0 |
| 1787.6858 | 0 |
| 1785.75734 | 0 |
| 1783.82888 | 0 |
| 1781.90041 | 0 |
| 1779.97195 | 0 |
| 1778.04348 | 0 |
| 1776.11502 | 0 |
| 1774.18656 | 0 |
| 1772.25809 | 0 |
| 1770.32963 | 0 |
| 1768.40117 | 0 |
| 1766.4727 | 0 |
| 1764.54424 | 0 |
| 1762.61578 | 0 |
| 1760.68731 | 0 |
| 1758.75885 | 0 |
| 1756.83038 | 0 |
| 1754.90192 | 0 |
| 1752.97346 | 0 |
| 1751.04499 | 0 |
| 1749.11653 | 0 |
| 1747.18807 | 0 |
| 1745.2596 | 0 |
| 1743.33114 | 0 |
| 1741.40267 | 0 |
| 1739.47421 | 0 |
| 1737.54575 | 0 |
| 1735.61728 | 0 |
| 1733.68882 | 0 |
| 1731.76036 | 0 |
| 1729.83189 | 0 |
| 1727.90343 | 0 |
| 1725.97497 | 0 |
| 1724.0465 | 0 |
| 1722.11804 | 0 |
| 1720.18957 | 0 |
| 1718.26111 | 0 |
| 1716.33265 | 0 |
| 1714.40418 | 0 |
| 1712.47572 | 0 |
| 1710.54726 | 0 |
| 1708.61879 | 0 |
| 1706.69033 | 0 |
| 1704.76187 | 0 |
| 1702.8334 | 0 |
| 1700.90494 | 0 |
| 1698.97647 | 0 |
| 1697.04801 | 0 |
| 1695.11955 | 0 |
| 1693.19108 | 0 |
| 1691.26262 | 0 |
| 1689.33416 | 0 |
| 1687.40569 | 0 |
| 1685.47723 | 0 |
| 1683.54877 | 0 |
| 1681.6203 | 0 |
| 1679.69184 | 0 |
| 1677.76337 | 0 |
| 1675.83491 | 0.001 |
| 1673.90645 | 0.001 |
| 1671.97798 | 0.001 |
| 1670.04952 | 0.002 |
| 1668.12106 | 0.002 |
| 1666.19259 | 0.003 |
| 1664.26413 | 0.004 |
| 1662.33567 | 0.005 |
| 1660.4072 | 0.006 |
| 1658.47874 | 0.006 |
| 1656.55027 | 0.007 |
| 1654.62181 | 0.007 |
| 1652.69335 | 0.006 |
| 1650.76488 | 0.005 |
| 1648.83642 | 0.005 |
| 1646.90796 | 0.004 |
| 1644.97949 | 0.004 |
| 1643.05103 | 0.004 |
| 1641.12257 | 0.004 |
| 1639.1941 | 0.004 |
| 1637.26564 | 0.004 |
| 1635.33717 | 0.004 |
| 1633.40871 | 0.004 |
| 1631.48025 | 0.003 |
| 1629.55178 | 0.003 |
| 1627.62332 | 0.003 |
| 1625.69486 | 0.003 |
| 1623.76639 | 0.003 |
| 1621.83793 | 0.003 |
| 1619.90946 | 0.003 |
| 1617.981 | 0.002 |
| 1616.05254 | 0.002 |
| 1614.12407 | 0.002 |
| 1612.19561 | 0.002 |
| 1610.26715 | 0.002 |
| 1608.33868 | 0.002 |
| 1606.41022 | 0.002 |
| 1604.48176 | 0.002 |
| 1602.55329 | 0.001 |
| 1600.62483 | 0.001 |
| 1598.69636 | 0.001 |
| 1596.7679 | 0.001 |
| 1594.83944 | 0.001 |
| 1592.91097 | 0.001 |
| 1590.98251 | 0.001 |
| 1589.05405 | 0.001 |
| 1587.12558 | 0.001 |
| 1585.19712 | 0.001 |
| 1583.26866 | 0.001 |
| 1581.34019 | 0.001 |
| 1579.41173 | 0.001 |
| 1577.48326 | 0.001 |
| 1575.5548 | 0.001 |
| 1573.62634 | 0.001 |
| 1571.69787 | 0.001 |
| 1569.76941 | 0.001 |
| 1567.84095 | 0.001 |
| 1565.91248 | 0.001 |
| 1563.98402 | 0.001 |
| 1562.05556 | 0.001 |
| 1560.12709 | 0.001 |
| 1558.19863 | 0.002 |
| 1556.27016 | 0.002 |
| 1554.3417 | 0.001 |
| 1552.41324 | 0.001 |
| 1550.48477 | 0.001 |
| 1548.55631 | 0.001 |
| 1546.62785 | 0.001 |
| 1544.69938 | 0.002 |
| 1542.77092 | 0.002 |
| 1540.84246 | 0.002 |
| 1538.91399 | 0.002 |
| 1536.98553 | 0.001 |
| 1535.05706 | 0.001 |
| 1533.1286 | 0.001 |
| 1531.20014 | 0.001 |
| 1529.27167 | 0.001 |
| 1527.34321 | 0.001 |
| 1525.41475 | 0.001 |
| 1523.48628 | 0.002 |
| 1521.55782 | 0.002 |
| 1519.62936 | 0.003 |
| 1517.70089 | 0.003 |
| 1515.77243 | 0.003 |
| 1513.84396 | 0.003 |
| 1511.9155 | 0.003 |
| 1509.98704 | 0.003 |
| 1508.05857 | 0.003 |
| 1506.13011 | 0.003 |
| 1504.20165 | 0.002 |
| 1502.27318 | 0.002 |
| 1500.34472 | 0.003 |
| 1498.41626 | 0.003 |
| 1496.48779 | 0.003 |
| 1494.55933 | 0.002 |
| 1492.63086 | 0.002 |
| 1490.7024 | 0.002 |
| 1488.77394 | 0.002 |
| 1486.84547 | 0.002 |
| 1484.91701 | 0.002 |
| 1482.98855 | 0.001 |
| 1481.06008 | 0.001 |
| 1479.13162 | 0.001 |
| 1477.20315 | 0.001 |
| 1475.27469 | 0.001 |
| 1473.34623 | 0.001 |
| 1471.41776 | 0.001 |
| 1469.4893 | 0.001 |
| 1467.56084 | 0.001 |
| 1465.63237 | 0.001 |
| 1463.70391 | 0.001 |
| 1461.77545 | 0.001 |
| 1459.84698 | 0.001 |
| 1457.91852 | 0.001 |
| 1455.99005 | 0.001 |
| 1454.06159 | 0.001 |
| 1452.13313 | 0.001 |
| 1450.20466 | 0.001 |
| 1448.2762 | 0.001 |
| 1446.34774 | 0.001 |
| 1444.41927 | 0.001 |
| 1442.49081 | 0.002 |
| 1440.56235 | 0.002 |
| 1438.63388 | 0.002 |
| 1436.70542 | 0.002 |
| 1434.77695 | 0.002 |
| 1432.84849 | 0.003 |
| 1430.92003 | 0.003 |
| 1428.99156 | 0.003 |
| 1427.0631 | 0.003 |
| 1425.13464 | 0.002 |
| 1423.20617 | 0.002 |
| 1421.27771 | 0.002 |
| 1419.34925 | 0.002 |
| 1417.42078 | 0.002 |
| 1415.49232 | 0.002 |
| 1413.56385 | 0.002 |
| 1411.63539 | 0.001 |
| 1409.70693 | 0.001 |
| 1407.77846 | 0.001 |
| 1405.85 | 0.001 |
| 1403.92154 | 0.001 |
| 1401.99307 | 0.001 |
| 1400.06461 | 0.002 |
| 1398.13615 | 0.002 |
| 1396.20768 | 0.003 |
| 1394.27922 | 0.003 |
| 1392.35075 | 0.003 |
| 1390.42229 | 0.003 |
| 1388.49383 | 0.003 |
| 1386.56536 | 0.003 |
| 1384.6369 | 0.002 |
| 1382.70844 | 0.002 |
| 1380.77997 | 0.002 |
| 1378.85151 | 0.002 |
| 1376.92305 | 0.001 |
| 1374.99458 | 0.001 |
| 1373.06612 | 0.001 |
| 1371.13765 | 0.001 |
| 1369.20919 | 0.001 |
| 1367.28073 | 0.002 |
| 1365.35226 | 0.002 |
| 1363.4238 | 0.002 |
| 1361.49534 | 0.002 |
| 1359.56687 | 0.002 |
| 1357.63841 | 0.001 |
| 1355.70995 | 0.001 |
| 1353.78148 | 0.001 |
| 1351.85302 | 0.001 |
| 1349.92455 | 0.001 |
| 1347.99609 | 0.001 |
| 1346.06763 | 0.001 |
| 1344.13916 | 0.001 |
| 1342.2107 | 0.001 |
| 1340.28224 | 0.002 |
| 1338.35377 | 0.002 |
| 1336.42531 | 0.002 |
| 1334.49684 | 0.001 |
| 1332.56838 | 0.001 |
| 1330.63992 | 0.001 |
| 1328.71145 | 0.001 |
| 1326.78299 | 0.001 |
| 1324.85453 | 0.001 |
| 1322.92606 | 0.001 |
| 1320.9976 | 0.001 |
| 1319.06914 | 0.001 |
| 1317.14067 | 0.001 |
| 1315.21221 | 0.001 |
| 1313.28374 | 0.001 |
| 1311.35528 | 0 |
| 1309.42682 | 0 |
| 1307.49835 | 0 |
| 1305.56989 | 0 |
| 1303.64143 | 0 |
| 1301.71296 | 0 |
| 1299.7845 | 0 |
| 1297.85604 | 0 |
| 1295.92757 | 0 |
| 1293.99911 | 0 |
| 1292.07064 | 0 |
| 1290.14218 | 0 |
| 1288.21372 | 0 |
| 1286.28525 | 0 |
| 1284.35679 | 0 |
| 1282.42833 | 0 |
| 1280.49986 | 0 |
| 1278.5714 | 0 |
| 1276.64294 | 0 |
| 1274.71447 | 0 |
| 1272.78601 | 0 |
| 1270.85754 | 0 |
| 1268.92908 | 0 |
| 1267.00062 | 0 |
| 1265.07215 | 0 |
| 1263.14369 | 0 |
| 1261.21523 | 0.001 |
| 1259.28676 | 0 |
| 1257.3583 | 0 |
| 1255.42984 | 0 |
| 1253.50137 | 0 |
| 1251.57291 | 0 |
| 1249.64444 | 0.001 |
| 1247.71598 | 0.001 |
| 1245.78752 | 0.001 |
| 1243.85905 | 0.002 |
| 1241.93059 | 0.002 |
| 1240.00213 | 0.003 |
| 1238.07366 | 0.003 |
| 1236.1452 | 0.003 |
| 1234.21674 | 0.003 |
| 1232.28827 | 0.003 |
| 1230.35981 | 0.003 |
| 1228.43134 | 0.003 |
| 1226.50288 | 0.002 |
| 1224.57442 | 0.002 |
| 1222.64595 | 0.002 |
| 1220.71749 | 0.002 |
| 1218.78903 | 0.003 |
| 1216.86056 | 0.003 |
| 1214.9321 | 0.004 |
| 1213.00364 | 0.004 |
| 1211.07517 | 0.005 |
| 1209.14671 | 0.005 |
| 1207.21824 | 0.006 |
| 1205.28978 | 0.006 |
| 1203.36132 | 0.007 |
| 1201.43285 | 0.007 |
| 1199.50439 | 0.007 |
| 1197.57593 | 0.007 |
| 1195.64746 | 0.008 |
| 1193.719 | 0.008 |
| 1191.79053 | 0.008 |
| 1189.86207 | 0.008 |
| 1187.93361 | 0.008 |
| 1186.00514 | 0.008 |
| 1184.07668 | 0.009 |
| 1182.14822 | 0.009 |
| 1180.21975 | 0.009 |
| 1178.29129 | 0.009 |
| 1176.36283 | 0.009 |
| 1174.43436 | 0.009 |
| 1172.5059 | 0.009 |
| 1170.57743 | 0.009 |
| 1168.64897 | 0.009 |
| 1166.72051 | 0.009 |
| 1164.79204 | 0.01 |
| 1162.86358 | 0.01 |
| 1160.93512 | 0.01 |
| 1159.00665 | 0.01 |
| 1157.07819 | 0.01 |
| 1155.14973 | 0.009 |
| 1153.22126 | 0.009 |
| 1151.2928 | 0.009 |
| 1149.36433 | 0.009 |
| 1147.43587 | 0.009 |
| 1145.50741 | 0.009 |
| 1143.57894 | 0.008 |
| 1141.65048 | 0.007 |
| 1139.72202 | 0.007 |
| 1137.79355 | 0.006 |
| 1135.86509 | 0.006 |
| 1133.93663 | 0.005 |
| 1132.00816 | 0.005 |
| 1130.0797 | 0.005 |
| 1128.15123 | 0.004 |
| 1126.22277 | 0.004 |
| 1124.29431 | 0.004 |
| 1122.36584 | 0.004 |
| 1120.43738 | 0.003 |
| 1118.50892 | 0.003 |
| 1116.58045 | 0.003 |
| 1114.65199 | 0.003 |
| 1112.72353 | 0.003 |
| 1110.79506 | 0.003 |
| 1108.8666 | 0.003 |
| 1106.93813 | 0.003 |
| 1105.00967 | 0.003 |
| 1103.08121 | 0.003 |
| 1101.15274 | 0.003 |
| 1099.22428 | 0.003 |
| 1097.29582 | 0.003 |
| 1095.36735 | 0.003 |
| 1093.43889 | 0.003 |
| 1091.51043 | 0.004 |
| 1089.58196 | 0.004 |
| 1087.6535 | 0.005 |
| 1085.72503 | 0.005 |
| 1083.79657 | 0.005 |
| 1081.86811 | 0.005 |
| 1079.93964 | 0.005 |
| 1078.01118 | 0.005 |
| 1076.08272 | 0.006 |
| 1074.15425 | 0.006 |
| 1072.22579 | 0.006 |
| 1070.29733 | 0.006 |
| 1068.36886 | 0.007 |
| 1066.4404 | 0.007 |
| 1064.51193 | 0.007 |
| 1062.58347 | 0.007 |
| 1060.65501 | 0.007 |
| 1058.72654 | 0.007 |
| 1056.79808 | 0.006 |
| 1054.86962 | 0.006 |
| 1052.94115 | 0.005 |
| 1051.01269 | 0.005 |
| 1049.08422 | 0.005 |
| 1047.15576 | 0.004 |
| 1045.2273 | 0.004 |
| 1043.29883 | 0.004 |
| 1041.37037 | 0.005 |
| 1039.44191 | 0.006 |
| 1037.51344 | 0.008 |
| 1035.58498 | 0.009 |
| 1033.65652 | 0.01 |
| 1031.72805 | 0.01 |
| 1029.79959 | 0.01 |
| 1027.87112 | 0.01 |
| 1025.94266 | 0.009 |
| 1024.0142 | 0.008 |
| 1022.08573 | 0.007 |
| 1020.15727 | 0.007 |
| 1018.22881 | 0.007 |
| 1016.30034 | 0.007 |
| 1014.37188 | 0.007 |
| 1012.44342 | 0.006 |
| 1010.51495 | 0.006 |
| 1008.58649 | 0.005 |
| 1006.65802 | 0.005 |
| 1004.72956 | 0.005 |
| 1002.8011 | 0.004 |
| 1000.87263 | 0.004 |
| 998.94417 | 0.004 |
| 997.01571 | 0.004 |
| 995.08724 | 0.004 |
| 993.15878 | 0.004 |
| 991.23032 | 0.004 |
| 989.30185 | 0.004 |
| 987.37339 | 0.004 |
| 985.44492 | 0.005 |
| 983.51646 | 0.005 |
| 981.588 | 0.005 |
| 979.65953 | 0.005 |
| 977.73107 | 0.005 |
| 975.80261 | 0.005 |
| 973.87414 | 0.005 |
| 971.94568 | 0.005 |
| 970.01722 | 0.005 |
| 968.08875 | 0.005 |
| 966.16029 | 0.005 |
| 964.23182 | 0.004 |
| 962.30336 | 0.004 |
| 960.3749 | 0.004 |
| 958.44643 | 0.004 |
| 956.51797 | 0.004 |
| 954.58951 | 0.004 |
| 952.66104 | 0.004 |
| 950.73258 | 0.003 |
| 948.80412 | 0.003 |
| 946.87565 | 0.003 |
| 944.94719 | 0.003 |
| 943.01872 | 0.003 |
| 941.09026 | 0.003 |
| 939.1618 | 0.003 |
| 937.23333 | 0.003 |
| 935.30487 | 0.003 |
| 933.37641 | 0.003 |
| 931.44794 | 0.003 |
| 929.51948 | 0.003 |
| 927.59102 | 0.003 |
| 925.66255 | 0.003 |
| 923.73409 | 0.003 |
| 921.80562 | 0.003 |
| 919.87716 | 0.003 |
| 917.9487 | 0.003 |
| 916.02023 | 0.003 |
| 914.09177 | 0.002 |
| 912.16331 | 0.002 |
| 910.23484 | 0.002 |
| 908.30638 | 0.002 |
| 906.37791 | 0.002 |
| 904.44945 | 0.002 |
| 902.52099 | 0.002 |
| 900.59252 | 0.003 |
| 898.66406 | 0.003 |
| 896.7356 | 0.003 |
| 894.80713 | 0.004 |
| 892.87867 | 0.004 |
| 890.95021 | 0.005 |
| 889.02174 | 0.005 |
| 887.09328 | 0.005 |
| 885.16481 | 0.005 |
| 883.23635 | 0.005 |
| 881.30789 | 0.005 |
| 879.37942 | 0.005 |
| 877.45096 | 0.005 |
| 875.5225 | 0.005 |
| 873.59403 | 0.005 |
| 871.66557 | 0.005 |
| 869.73711 | 0.004 |
| 867.80864 | 0.004 |
| 865.88018 | 0.004 |
| 863.95171 | 0.004 |
| 862.02325 | 0.003 |
| 860.09479 | 0.003 |
| 858.16632 | 0.003 |
| 856.23786 | 0.003 |
| 854.3094 | 0.003 |
| 852.38093 | 0.003 |
| 850.45247 | 0.002 |
| 848.52401 | 0.002 |
| 846.59554 | 0.002 |
| 844.66708 | 0.002 |
| 842.73861 | 0.002 |
| 840.81015 | 0.002 |
| 838.88169 | 0.002 |
| 836.95322 | 0.002 |
| 835.02476 | 0.002 |
| 833.0963 | 0.002 |
| 831.16783 | 0.002 |
| 829.23937 | 0.002 |
| 827.31091 | 0.002 |
| 825.38244 | 0.001 |
| 823.45398 | 0.001 |
| 821.52551 | 0.001 |
| 819.59705 | 0.001 |
| 817.66859 | 0.001 |
| 815.74012 | 0.001 |
| 813.81166 | 0.001 |
| 811.8832 | 0.001 |
| 809.95473 | 0.001 |
| 808.02627 | 0.001 |
| 806.09781 | 0.001 |
| 804.16934 | 0.001 |
| 802.24088 | 0.001 |
| 800.31241 | 0.001 |
| 798.38395 | 0.002 |
| 796.45549 | 0.002 |
| 794.52702 | 0.004 |
| 792.59856 | 0.005 |
| 790.6701 | 0.006 |
| 788.74163 | 0.005 |
| 786.81317 | 0.004 |
| 784.88471 | 0.003 |
| 782.95624 | 0.002 |
| 781.02778 | 0.002 |
| 779.09931 | 0.002 |
| 777.17085 | 0.001 |
| 775.24239 | 0.001 |
| 773.31392 | 0.001 |
| 771.38546 | 0.001 |
| 769.457 | 0.002 |
| 767.52853 | 0.003 |
| 765.60007 | 0.004 |
| 763.6716 | 0.005 |
| 761.74314 | 0.004 |
| 759.81468 | 0.003 |
| 757.88621 | 0.003 |
| 755.95775 | 0.002 |
| 754.02929 | 0.002 |
| 752.10082 | 0.002 |
| 750.17236 | 0.002 |
| 748.2439 | 0.002 |
| 746.31543 | 0.002 |
| 744.38697 | 0.002 |
| 742.4585 | 0.002 |
| 740.53004 | 0.001 |
| 738.60158 | 0.001 |
| 736.67311 | 0.001 |
| 734.74465 | 0.001 |
| 732.81619 | 0.001 |
| 730.88772 | 0.001 |
| 728.95926 | 0.001 |
| 727.0308 | 0.001 |
| 725.10233 | 0.001 |
| 723.17387 | 0.001 |
| 721.2454 | 0.001 |
| 719.31694 | 0.001 |
| 717.38848 | 0.001 |
| 715.46001 | 0.001 |
| 713.53155 | 0.001 |
| 711.60309 | 0.001 |
| 709.67462 | 0.001 |
| 707.74616 | 0.001 |
| 705.8177 | 0.001 |
| 703.88923 | 0.001 |
| 701.96077 | 0.001 |
| 700.0323 | 0.001 |
| 698.10384 | 0.001 |
| 696.17538 | 0.001 |
| 694.24691 | 0.001 |
| 692.31845 | 0.001 |
| 690.38999 | 0.001 |
| 688.46152 | 0.001 |
| 686.53306 | 0.001 |
| 684.6046 | 0.001 |
| 682.67613 | 0 |
| 680.74767 | 0 |
| 678.8192 | 0 |
| 676.89074 | 0 |
| 674.96228 | 0 |
| 673.03381 | 0 |
| 671.10535 | 0 |
| 669.17689 | 0.001 |
| 667.24842 | 0.002 |
| 665.31996 | 0.003 |
| 663.3915 | 0.002 |
| 661.46303 | 0.002 |
| 659.53457 | 0.001 |
| 657.6061 | 0.001 |
| 655.67764 | 0 |
| 653.74918 | 0 |
| 651.82071 | 0 |
| 649.89225 | 0 |
| 647.96379 | 0 |
| 646.03532 | 0 |
| 644.10686 | 0 |
| 642.1784 | 0 |
| 640.24993 | 0 |
| 638.32147 | 0 |
| 636.393 | 0 |
| 634.46454 | 0 |
| 632.53608 | 0.001 |
| 630.60761 | 0.001 |
| 628.67915 | 0.002 |
| 626.75069 | 0.003 |
| 624.82222 | 0.003 |
| 622.89376 | 0.002 |
| 620.96529 | 0.002 |
| 619.03683 | 0.002 |
| 617.10837 | 0.002 |
| 615.1799 | 0.003 |
| 613.25144 | 0.005 |
| 611.32298 | 0.006 |
| 609.39451 | 0.006 |
| 607.46605 | 0.006 |
| 605.53759 | 0.005 |
| 603.60912 | 0.004 |
| 601.68066 | 0.004 |
| 599.75219 | 0.003 |
| 597.82373 | 0.003 |
| 595.89527 | 0.002 |
| 593.9668 | 0.002 |
| 592.03834 | 0.002 |
| 590.10988 | 0.001 |
| 588.18141 | 0.001 |
| 586.25295 | 0.001 |
| 584.32449 | 0.001 |
| 582.39602 | 0 |
| 580.46756 | 0 |
| 578.53909 | 0 |
| 576.61063 | 0 |
| 574.68217 | 0 |
| 572.7537 | 0 |
| 570.82524 | 0.001 |
| 568.89678 | 0.002 |
| 566.96831 | 0.002 |
| 565.03985 | 0.003 |
| 563.11139 | 0.002 |
| 561.18292 | 0.002 |
| 559.25446 | 0.002 |
| 557.32599 | 0.001 |
| 555.39753 | 0.001 |
| 553.46907 | 0.001 |
| 551.5406 | 0.001 |
| 549.61214 | 0.001 |
| 547.68368 | 0.001 |
| 545.75521 | 0.001 |
| 543.82675 | 0.002 |
| 541.89829 | 0.002 |
| 539.96982 | 0.002 |
| 538.04136 | 0.002 |
| 536.11289 | 0.003 |
| 534.18443 | 0.003 |
| 532.25597 | 0.003 |
| 530.3275 | 0.004 |
| 528.39904 | 0.003 |
| 526.47058 | 0.003 |
| 524.54211 | 0.003 |
| 522.61365 | 0.002 |
| 520.68519 | 0.002 |
| 518.75672 | 0.002 |
| 516.82826 | 0.001 |
| 514.89979 | 0.001 |
| 512.97133 | 0.001 |
| 511.04287 | 0 |
| 509.1144 | 0 |
| 507.18594 | 0 |
| 505.25748 | 0 |
| 503.32901 | 0 |
| 501.40055 | 0 |
| 499.47209 | 0 |